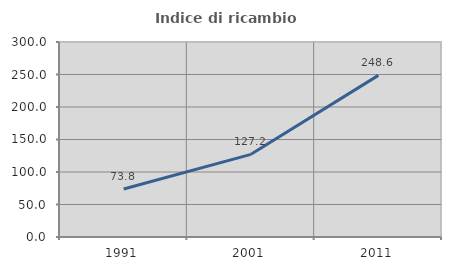
| Category | Indice di ricambio occupazionale  |
|---|---|
| 1991.0 | 73.839 |
| 2001.0 | 127.19 |
| 2011.0 | 248.624 |